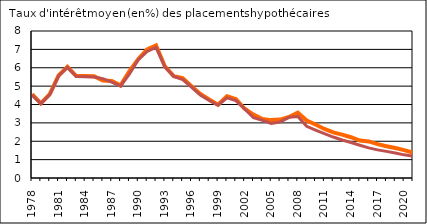
| Category | Vaud | Suisse |
|---|---|---|
| 1978.0 | 4.56 | 4.51 |
| 1979.0 | 4.06 | 4.05 |
| 1980.0 | 4.56 | 4.52 |
| 1981.0 | 5.58 | 5.55 |
| 1982.0 | 6.05 | 6.02 |
| 1983.0 | 5.55 | 5.52 |
| 1984.0 | 5.55 | 5.51 |
| 1985.0 | 5.54 | 5.5 |
| 1986.0 | 5.3 | 5.41 |
| 1987.0 | 5.28 | 5.22 |
| 1988.0 | 5.04 | 5 |
| 1989.0 | 5.82 | 5.67 |
| 1990.0 | 6.48 | 6.44 |
| 1991.0 | 7 | 6.89 |
| 1992.0 | 7.22 | 7.11 |
| 1993.0 | 6.07 | 6.04 |
| 1994.0 | 5.54 | 5.53 |
| 1995.0 | 5.44 | 5.36 |
| 1996.0 | 5 | 4.95 |
| 1997.0 | 4.57 | 4.51 |
| 1998.0 | 4.27 | 4.22 |
| 1999.0 | 3.99 | 3.96 |
| 2000.0 | 4.45 | 4.36 |
| 2001.0 | 4.3 | 4.21 |
| 2002.0 | 3.77 | 3.76 |
| 2003.0 | 3.45 | 3.28 |
| 2004.0 | 3.21 | 3.14 |
| 2005.0 | 3.15 | 2.97 |
| 2006.0 | 3.18 | 3.05 |
| 2007.0 | 3.32 | 3.3 |
| 2008.0 | 3.56 | 3.35 |
| 2009.0 | 3.13 | 2.81 |
| 2010.0 | 2.91 | 2.61 |
| 2011.0 | 2.67 | 2.42 |
| 2012.0 | 2.48 | 2.23 |
| 2013.0 | 2.36 | 2.07 |
| 2014.0 | 2.22 | 1.93 |
| 2015.0 | 2.04 | 1.78 |
| 2016.0 | 1.99 | 1.64 |
| 2017.0 | 1.84 | 1.53 |
| 2018.0 | 1.73 | 1.45 |
| 2019.0 | 1.63 | 1.36 |
| 2020.0 | 1.52 | 1.26 |
| 2021.0 | 1.38 | 1.19 |